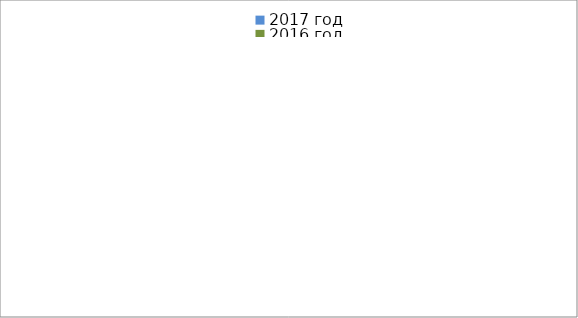
| Category | 2017 год | 2016 год |
|---|---|---|
|  - поджог | 14 | 36 |
|  - неосторожное обращение с огнём | 7 | 22 |
|  - НПТЭ электрооборудования | 14 | 17 |
|  - НПУ и Э печей | 39 | 31 |
|  - НПУ и Э транспортных средств | 44 | 24 |
|   -Шалость с огнем детей | 3 | 5 |
|  -НППБ при эксплуатации эл.приборов | 22 | 9 |
|  - курение | 30 | 16 |
| - прочие | 65 | 75 |
| - не установленные причины | 0 | 12 |